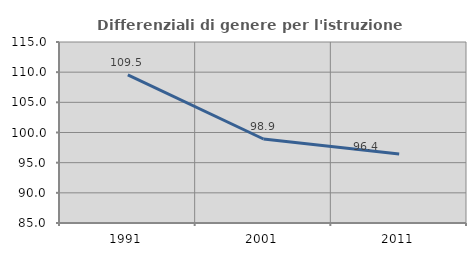
| Category | Differenziali di genere per l'istruzione superiore |
|---|---|
| 1991.0 | 109.536 |
| 2001.0 | 98.925 |
| 2011.0 | 96.449 |